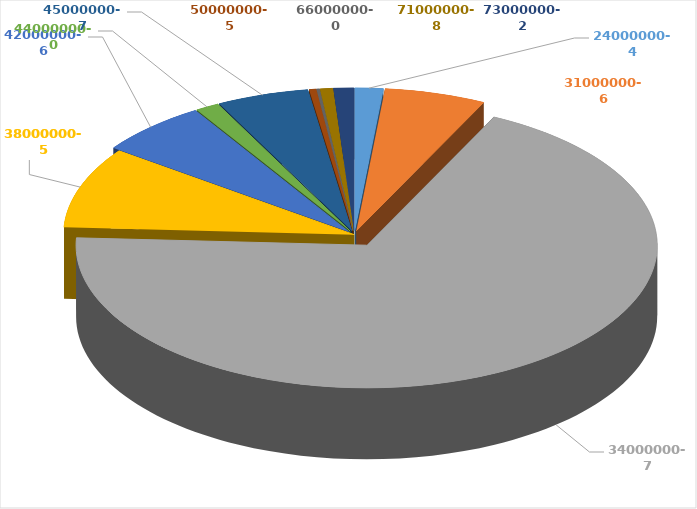
| Category | Series 0 |
|---|---|
| 0 | 2160000 |
| 1 | 7733939 |
| 2 | 94193029 |
| 3 | 12593960 |
| 4 | 8445850 |
| 5 | 1810640 |
| 6 | 7016282 |
| 7 | 547280 |
| 8 | 243680 |
| 9 | 974992 |
| 10 | 1555959 |